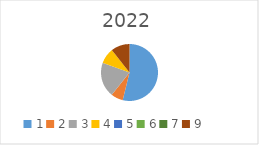
| Category | Series 0 |
|---|---|
| 1.0 | 7043141.29 |
| 2.0 | 897539.66 |
| 3.0 | 2591620.2 |
| 4.0 | 1159168.13 |
| 5.0 | 0 |
| 6.0 | 0 |
| 7.0 | 0 |
| 9.0 | 1388141.63 |